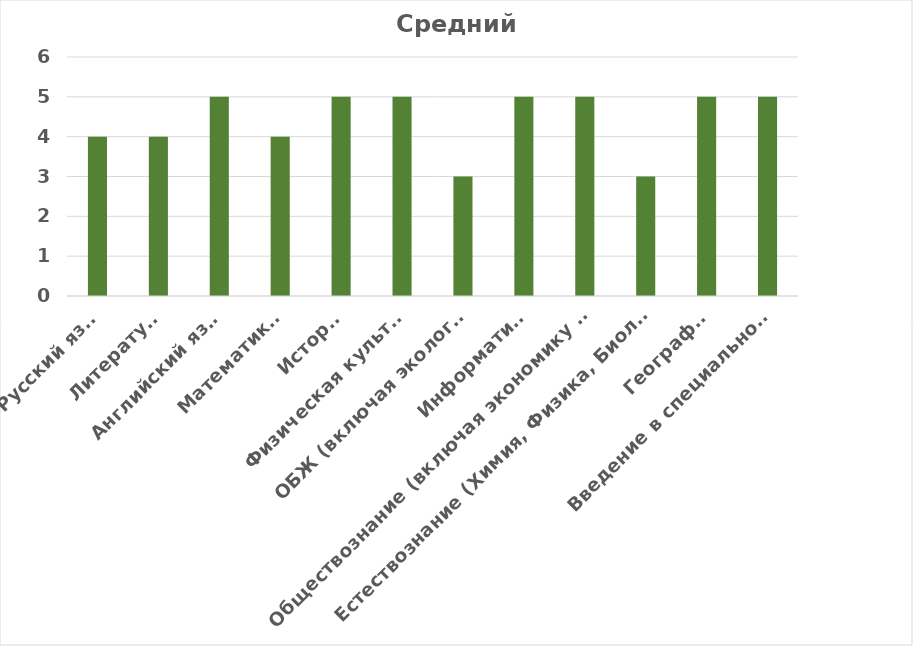
| Category | Средний балл |
|---|---|
| Русский язык | 4 |
| Литература | 4 |
| Английский язык | 5 |
| Математика  | 4 |
| История | 5 |
| Физическая культура | 5 |
| ОБЖ (включая экологию) | 3 |
|  Информатика  | 5 |
| Обществознание (включая экономику и право) (профильный уровень) | 5 |
| Естествознание (Химия, Физика, Биология) | 3 |
| География | 5 |
| Введение в специальность | 5 |